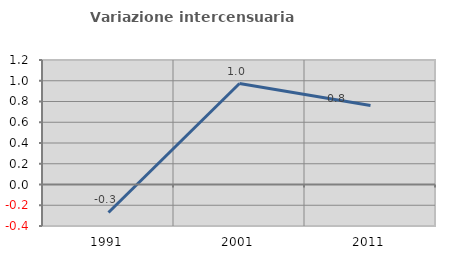
| Category | Variazione intercensuaria annua |
|---|---|
| 1991.0 | -0.27 |
| 2001.0 | 0.973 |
| 2011.0 | 0.761 |